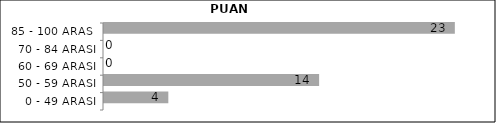
| Category | Series 0 | Series 1 | Series 2 |
|---|---|---|---|
| 0 - 49 ARASI |  |  | 4 |
| 50 - 59 ARASI |  |  | 14 |
| 60 - 69 ARASI |  |  | 0 |
| 70 - 84 ARASI |  |  | 0 |
| 85 - 100 ARASI |  |  | 23 |